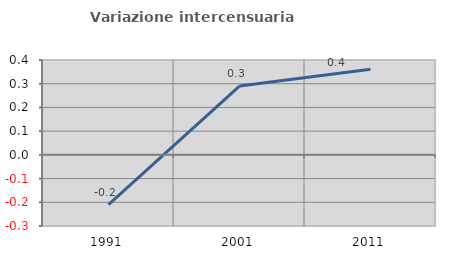
| Category | Variazione intercensuaria annua |
|---|---|
| 1991.0 | -0.21 |
| 2001.0 | 0.29 |
| 2011.0 | 0.361 |